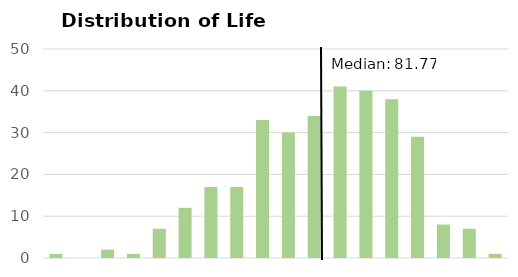
| Category | Frequency |
|---|---|
| 76.87314786 | 1 |
| 77.35493476 | 0 |
| 77.83672165 | 2 |
| 78.31850855 | 1 |
| 78.80029545 | 7 |
| 79.28208234 | 12 |
| 79.76386924 | 17 |
| 80.24565614 | 17 |
| 80.72744303 | 33 |
| 81.20922993 | 30 |
| 81.69101683 | 34 |
| 82.17280372 | 41 |
| 82.65459062 | 40 |
| 83.13637752 | 38 |
| 83.61816441 | 29 |
| 84.09995131 | 8 |
| 84.58173821 | 7 |
| More | 1 |